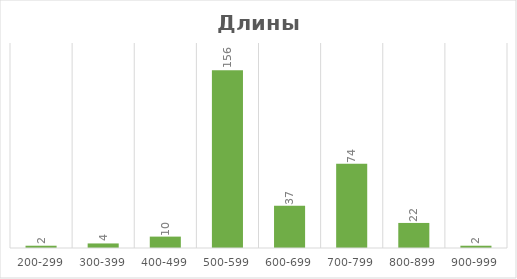
| Category | Series 0 |
|---|---|
| 200-299 | 2 |
| 300-399 | 4 |
| 400-499 | 10 |
| 500-599 | 156 |
| 600-699 | 37 |
| 700-799 | 74 |
| 800-899 | 22 |
| 900-999 | 2 |